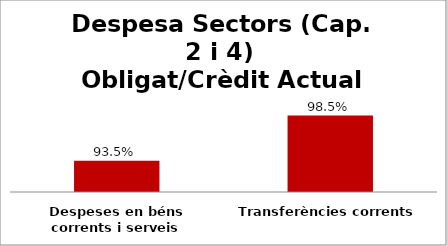
| Category | Series 0 |
|---|---|
| Despeses en béns corrents i serveis | 0.935 |
| Transferències corrents | 0.985 |